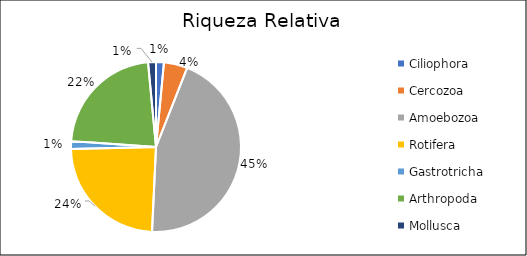
| Category | Series 0 |
|---|---|
| Ciliophora | 0.015 |
| Cercozoa | 0.045 |
| Amoebozoa | 0.448 |
| Rotifera | 0.239 |
| Gastrotricha | 0.015 |
| Arthropoda | 0.224 |
| Mollusca | 0.015 |